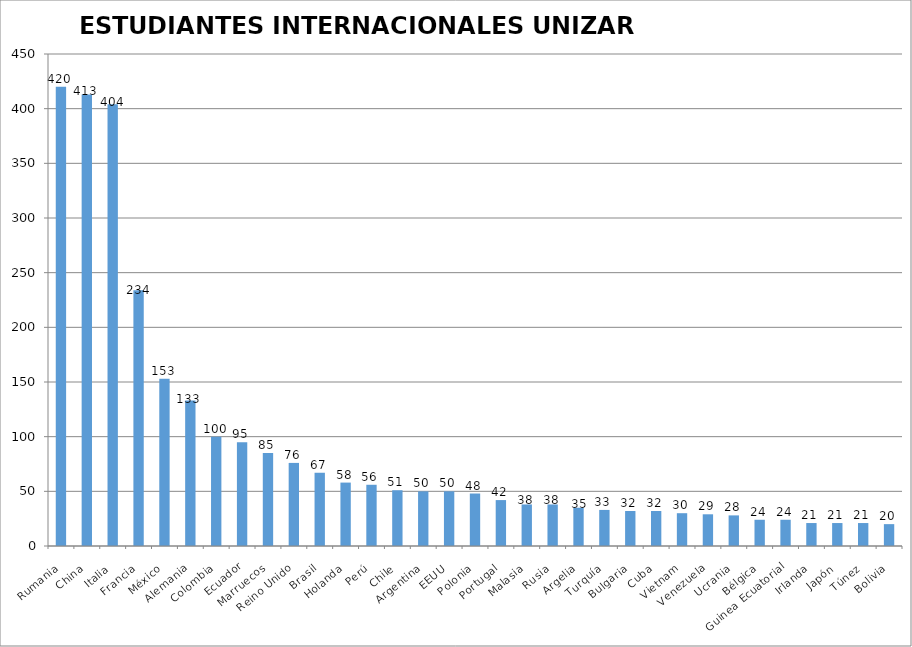
| Category | ESTUDIANTES INTERNACIONALES UNIZAR |
|---|---|
| Rumania | 420 |
| China | 413 |
| Italia | 404 |
| Francia | 234 |
| México | 153 |
| Alemania | 133 |
| Colombia | 100 |
| Ecuador | 95 |
| Marruecos | 85 |
| Reino Unido | 76 |
| Brasil | 67 |
| Holanda | 58 |
| Perú | 56 |
| Chile | 51 |
| Argentina | 50 |
| EEUU | 50 |
| Polonia | 48 |
| Portugal | 42 |
| Malasia | 38 |
| Rusia | 38 |
| Argelia | 35 |
| Turquía | 33 |
| Bulgaria | 32 |
| Cuba | 32 |
| Vietnam | 30 |
| Venezuela | 29 |
| Ucrania | 28 |
| Bélgica | 24 |
| Guinea Ecuatorial | 24 |
| Irlanda | 21 |
| Japón | 21 |
| Túnez | 21 |
| Bolivia | 20 |